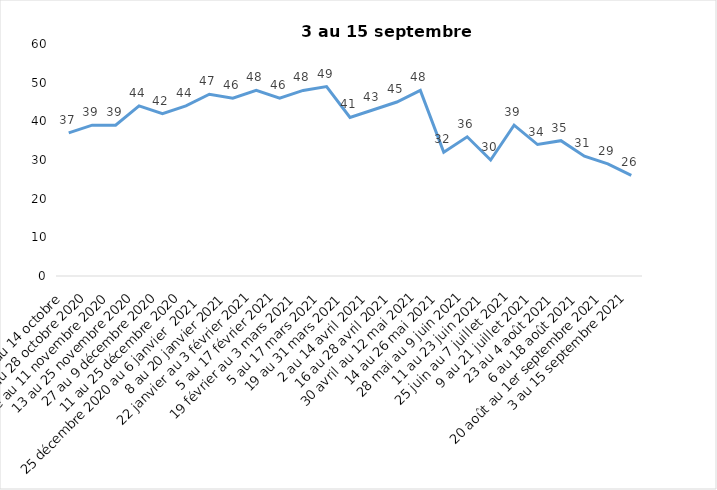
| Category | Toujours aux trois mesures |
|---|---|
| 2 au 14 octobre  | 37 |
| 16 au 28 octobre 2020 | 39 |
| 30 octobre au 11 novembre 2020 | 39 |
| 13 au 25 novembre 2020 | 44 |
| 27 au 9 décembre 2020 | 42 |
| 11 au 25 décembre 2020 | 44 |
| 25 décembre 2020 au 6 janvier  2021 | 47 |
| 8 au 20 janvier 2021 | 46 |
| 22 janvier au 3 février 2021 | 48 |
| 5 au 17 février 2021 | 46 |
| 19 février au 3 mars 2021 | 48 |
| 5 au 17 mars 2021 | 49 |
| 19 au 31 mars 2021 | 41 |
| 2 au 14 avril 2021 | 43 |
| 16 au 28 avril 2021 | 45 |
| 30 avril au 12 mai 2021 | 48 |
| 14 au 26 mai 2021 | 32 |
| 28 mai au 9 juin 2021 | 36 |
| 11 au 23 juin 2021 | 30 |
| 25 juin au 7 juillet 2021 | 39 |
| 9 au 21 juillet 2021 | 34 |
| 23 au 4 août 2021 | 35 |
| 6 au 18 août 2021 | 31 |
| 20 août au 1er septembre 2021 | 29 |
| 3 au 15 septembre 2021 | 26 |